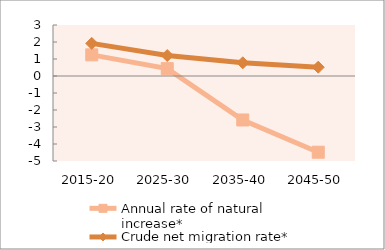
| Category | Annual rate of natural increase* | Crude net migration rate* |
|---|---|---|
| 2015-20 | 1.245 | 1.918 |
| 2025-30 | 0.434 | 1.204 |
| 2035-40 | -2.587 | 0.777 |
| 2045-50 | -4.483 | 0.517 |